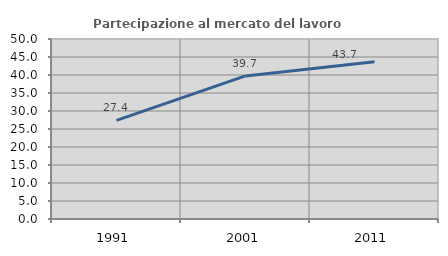
| Category | Partecipazione al mercato del lavoro  femminile |
|---|---|
| 1991.0 | 27.397 |
| 2001.0 | 39.744 |
| 2011.0 | 43.678 |